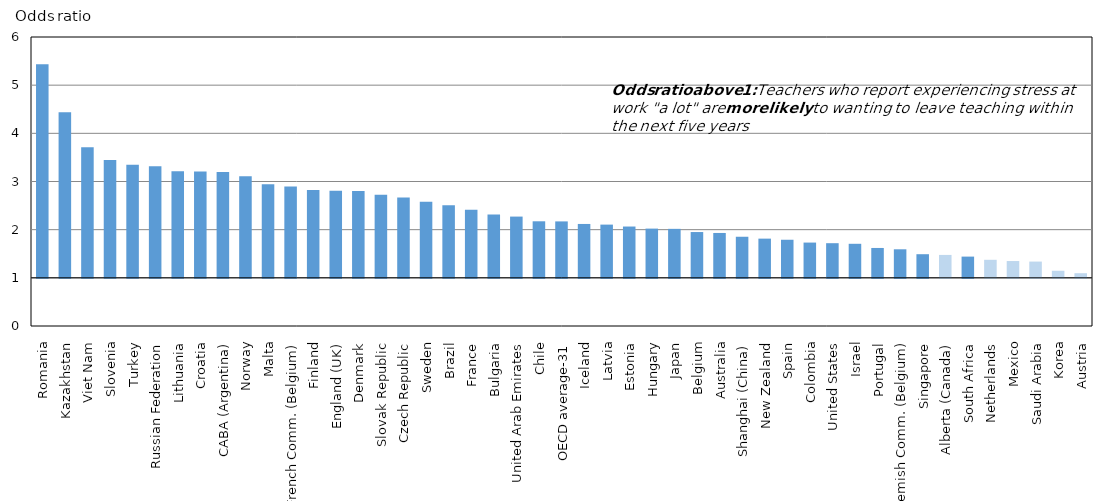
| Category | Before accounting for school factors, motivation and self-efficacy |
|---|---|
| Romania | 5.434 |
| Kazakhstan | 4.437 |
| Viet Nam | 3.713 |
| Slovenia | 3.447 |
| Turkey | 3.345 |
| Russian Federation | 3.317 |
| Lithuania | 3.212 |
| Croatia | 3.209 |
| CABA (Argentina) | 3.198 |
| Norway | 3.109 |
| Malta | 2.942 |
| French Comm. (Belgium) | 2.896 |
| Finland | 2.824 |
| England (UK) | 2.81 |
| Denmark | 2.802 |
| Slovak Republic | 2.727 |
| Czech Republic | 2.67 |
| Sweden | 2.581 |
| Brazil | 2.509 |
| France | 2.414 |
| Bulgaria | 2.316 |
| United Arab Emirates | 2.272 |
| Chile | 2.174 |
| OECD average-31 | 2.172 |
| Iceland | 2.119 |
| Latvia | 2.105 |
| Estonia | 2.065 |
| Hungary | 2.022 |
| Japan | 2.017 |
| Belgium | 1.951 |
| Australia | 1.932 |
| Shanghai (China) | 1.853 |
| New Zealand | 1.814 |
| Spain | 1.791 |
| Colombia | 1.732 |
| United States | 1.719 |
| Israel | 1.707 |
| Portugal | 1.62 |
| Flemish Comm. (Belgium) | 1.593 |
| Singapore | 1.491 |
| Alberta (Canada) | 1.475 |
| South Africa | 1.441 |
| Netherlands | 1.374 |
| Mexico | 1.349 |
| Saudi Arabia | 1.338 |
| Korea | 1.147 |
| Austria | 1.096 |